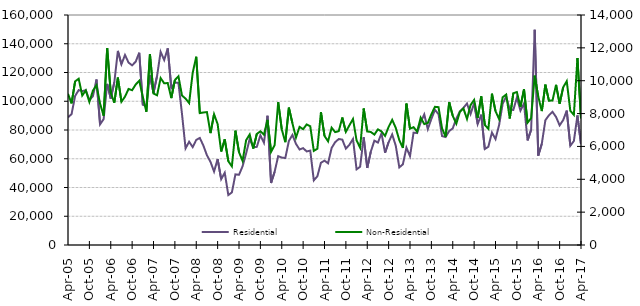
| Category | Residential |
|---|---|
| 2005-04-01 | 88840 |
| 2005-05-01 | 91030 |
| 2005-06-01 | 103700 |
| 2005-07-01 | 107770 |
| 2005-08-01 | 107040 |
| 2005-09-01 | 107710 |
| 2005-10-01 | 100650 |
| 2005-11-01 | 103570 |
| 2005-12-01 | 115150 |
| 2006-01-01 | 83980 |
| 2006-02-01 | 87550 |
| 2006-03-01 | 112090 |
| 2006-04-01 | 101830 |
| 2006-05-01 | 113160 |
| 2006-06-01 | 135030 |
| 2006-07-01 | 125720 |
| 2006-08-01 | 132180 |
| 2006-09-01 | 126890 |
| 2006-10-01 | 124980 |
| 2006-11-01 | 127530 |
| 2006-12-01 | 133770 |
| 2007-01-01 | 97580 |
| 2007-02-01 | 96560 |
| 2007-03-01 | 117970 |
| 2007-04-01 | 105780 |
| 2007-05-01 | 117560 |
| 2007-06-01 | 134370 |
| 2007-07-01 | 128660 |
| 2007-08-01 | 136790 |
| 2007-09-01 | 109250 |
| 2007-10-01 | 113080 |
| 2007-11-01 | 112770 |
| 2007-12-01 | 91140 |
| 2008-01-01 | 67220 |
| 2008-02-01 | 71820 |
| 2008-03-01 | 68100 |
| 2008-04-01 | 73130 |
| 2008-05-01 | 74470 |
| 2008-06-01 | 69150 |
| 2008-07-01 | 62400 |
| 2008-08-01 | 57810 |
| 2008-09-01 | 51080 |
| 2008-10-01 | 59710 |
| 2008-11-01 | 45780 |
| 2008-12-01 | 50260 |
| 2009-01-01 | 34750 |
| 2009-02-01 | 36580 |
| 2009-03-01 | 49130 |
| 2009-04-01 | 48840 |
| 2009-05-01 | 54720 |
| 2009-06-01 | 63710 |
| 2009-07-01 | 73760 |
| 2009-08-01 | 68080 |
| 2009-09-01 | 68260 |
| 2009-10-01 | 76320 |
| 2009-11-01 | 71150 |
| 2009-12-01 | 89920 |
| 2010-01-01 | 43110 |
| 2010-02-01 | 50920 |
| 2010-03-01 | 61810 |
| 2010-04-01 | 60830 |
| 2010-05-01 | 60500 |
| 2010-06-01 | 72370 |
| 2010-07-01 | 76590 |
| 2010-08-01 | 70320 |
| 2010-09-01 | 66440 |
| 2010-10-01 | 67380 |
| 2010-11-01 | 65080 |
| 2010-12-01 | 65650 |
| 2011-01-01 | 44970 |
| 2011-02-01 | 47830 |
| 2011-03-01 | 57200 |
| 2011-04-01 | 58700 |
| 2011-05-01 | 56820 |
| 2011-06-01 | 67500 |
| 2011-07-01 | 71550 |
| 2011-08-01 | 73720 |
| 2011-09-01 | 73310 |
| 2011-10-01 | 67030 |
| 2011-11-01 | 69730 |
| 2011-12-01 | 73780 |
| 2012-01-01 | 52630 |
| 2012-02-01 | 54440 |
| 2012-03-01 | 74960 |
| 2012-04-01 | 53590 |
| 2012-05-01 | 64960 |
| 2012-06-01 | 72590 |
| 2012-07-01 | 71240 |
| 2012-08-01 | 77690 |
| 2012-09-01 | 64200 |
| 2012-10-01 | 71490 |
| 2012-11-01 | 76910 |
| 2012-12-01 | 69100 |
| 2013-01-01 | 53990 |
| 2013-02-01 | 56120 |
| 2013-03-01 | 67740 |
| 2013-04-01 | 61780 |
| 2013-05-01 | 78170 |
| 2013-06-01 | 77850 |
| 2013-07-01 | 85310 |
| 2013-08-01 | 90850 |
| 2013-09-01 | 80640 |
| 2013-10-01 | 87730 |
| 2013-11-01 | 94020 |
| 2013-12-01 | 91030 |
| 2014-01-01 | 75750 |
| 2014-02-01 | 75100 |
| 2014-03-01 | 79280 |
| 2014-04-01 | 81140 |
| 2014-05-01 | 87930 |
| 2014-06-01 | 92950 |
| 2014-07-01 | 95430 |
| 2014-08-01 | 98450 |
| 2014-09-01 | 91170 |
| 2014-10-01 | 98630 |
| 2014-11-01 | 84150 |
| 2014-12-01 | 90650 |
| 2015-01-01 | 66750 |
| 2015-02-01 | 68390 |
| 2015-03-01 | 78240 |
| 2015-04-01 | 73690 |
| 2015-05-01 | 83310 |
| 2015-06-01 | 98200 |
| 2015-07-01 | 103160 |
| 2015-08-01 | 94260 |
| 2015-09-01 | 93940 |
| 2015-10-01 | 102540 |
| 2015-11-01 | 93490 |
| 2015-12-01 | 98400 |
| 2016-01-01 | 72750 |
| 2016-02-01 | 80110 |
| 2016-03-01 | 149710 |
| 2016-04-01 | 62160 |
| 2016-05-01 | 70470 |
| 2016-06-01 | 86830 |
| 2016-07-01 | 90210 |
| 2016-08-01 | 92630 |
| 2016-09-01 | 89090 |
| 2016-10-01 | 83240 |
| 2016-11-01 | 86890 |
| 2016-12-01 | 93510 |
| 2017-01-01 | 69040 |
| 2017-02-01 | 72310 |
| 2017-03-01 | 90120 |
| 2017-04-01 | 70210 |